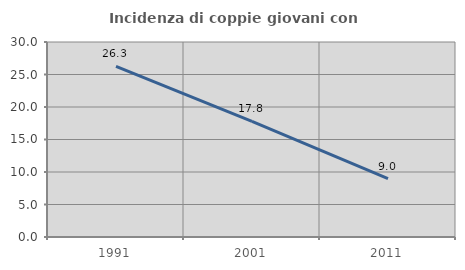
| Category | Incidenza di coppie giovani con figli |
|---|---|
| 1991.0 | 26.261 |
| 2001.0 | 17.79 |
| 2011.0 | 8.991 |